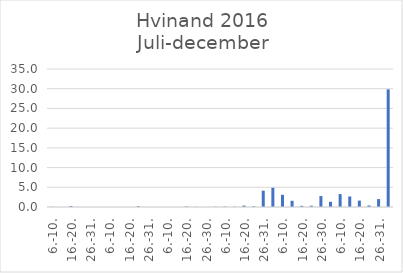
| Category | Series 0 |
|---|---|
| 6.-10. | 0.058 |
| 11.-15. | 0 |
| 16.-20. | 0.255 |
| 21.-25. | 0 |
| 26.-31. | 0 |
| 1.-5 | 0 |
| 6.-10. | 0 |
| 11.-15. | 0 |
| 16.-20. | 0 |
| 21.-25. | 0.202 |
| 26.-31. | 0 |
| 1.-5 | 0 |
| 6.-10. | 0 |
| 11.-15. | 0 |
| 16.-20. | 0.14 |
| 21.-25. | 0.032 |
| 26.-30. | 0 |
| 1.-5 | 0.071 |
| 6.-10. | 0.12 |
| 11.-15. | 0.071 |
| 16.-20. | 0.364 |
| 21.-25. | 0.177 |
| 26.-31. | 4.136 |
| 1.-5 | 4.869 |
| 6.-10. | 3.079 |
| 11.-15. | 1.571 |
| 16.-20. | 0.302 |
| 21.-25. | 0.329 |
| 26.-30. | 2.77 |
| 1.-5 | 1.313 |
| 6.-10. | 3.278 |
| 11.-15. | 2.677 |
| 16.-20. | 1.626 |
| 21.-25. | 0.386 |
| 26.-31. | 2.006 |
| I alt | 29.832 |